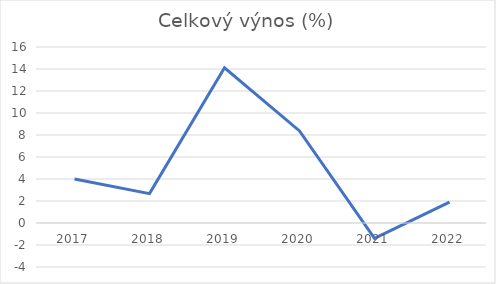
| Category | Celkový výnos (%) |
|---|---|
| 2017.0 | 4 |
| 2018.0 | 2.67 |
| 2019.0 | 14.11 |
| 2020.0 | 8.37 |
| 2021.0 | -1.4 |
| 2022.0 | 1.9 |